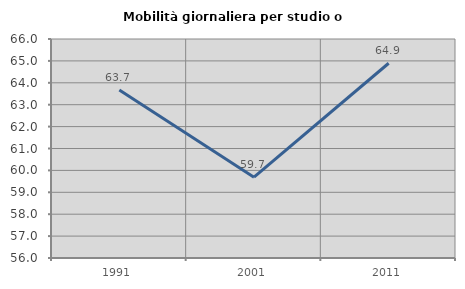
| Category | Mobilità giornaliera per studio o lavoro |
|---|---|
| 1991.0 | 63.669 |
| 2001.0 | 59.69 |
| 2011.0 | 64.893 |